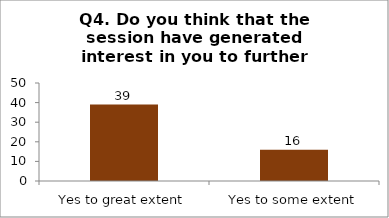
| Category | Q4. Do you think that the session have generated interest in you to further explore the topics? |
|---|---|
| Yes to great extent | 39 |
| Yes to some extent | 16 |